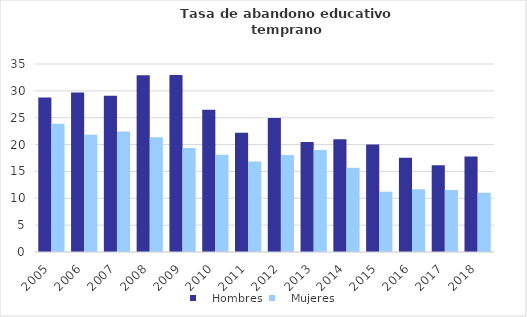
| Category |    Hombres |    Mujeres |
|---|---|---|
| 2005.0 | 28.743 | 23.884 |
| 2006.0 | 29.693 | 21.839 |
| 2007.0 | 29.068 | 22.456 |
| 2008.0 | 32.896 | 21.354 |
| 2009.0 | 32.94 | 19.372 |
| 2010.0 | 26.479 | 18.113 |
| 2011.0 | 22.187 | 16.87 |
| 2012.0 | 24.951 | 18.071 |
| 2013.0 | 20.482 | 18.997 |
| 2014.0 | 20.981 | 15.689 |
| 2015.0 | 20 | 11.226 |
| 2016.0 | 17.544 | 11.683 |
| 2017.0 | 16.132 | 11.543 |
| 2018.0 | 17.802 | 11.032 |